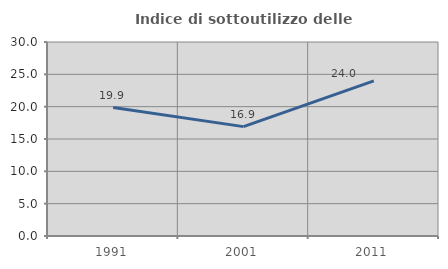
| Category | Indice di sottoutilizzo delle abitazioni  |
|---|---|
| 1991.0 | 19.863 |
| 2001.0 | 16.912 |
| 2011.0 | 24 |